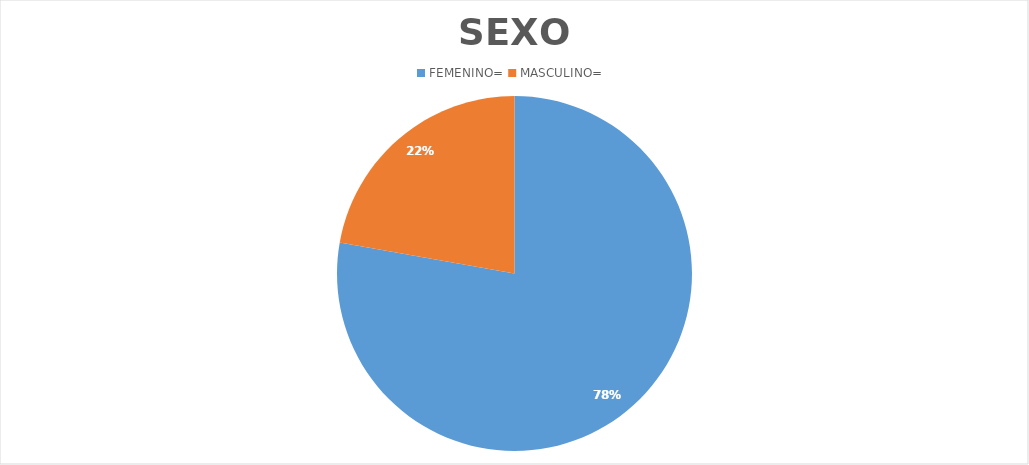
| Category | Series 0 |
|---|---|
| FEMENINO=  | 410 |
| MASCULINO=  | 117 |